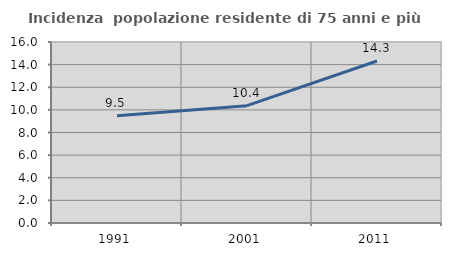
| Category | Incidenza  popolazione residente di 75 anni e più |
|---|---|
| 1991.0 | 9.481 |
| 2001.0 | 10.369 |
| 2011.0 | 14.323 |